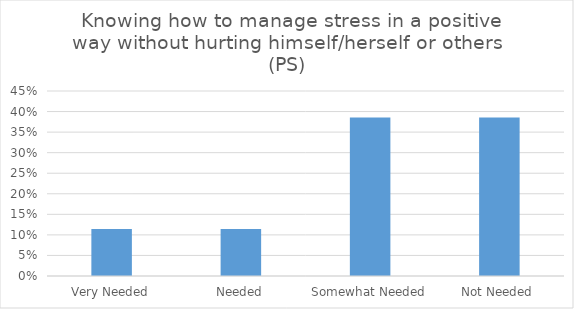
| Category | Knowing how to manage stress in a positive way without hurting himself/herself or others. (PS) |
|---|---|
| Very Needed | 0.115 |
| Needed | 0.115 |
| Somewhat Needed | 0.385 |
| Not Needed | 0.385 |